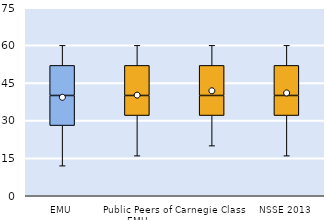
| Category | 25th | 50th | 75th |
|---|---|---|---|
| EMU | 28 | 12 | 12 |
| Public Peers of EMU | 32 | 8 | 12 |
| Carnegie Class | 32 | 8 | 12 |
| NSSE 2013 | 32 | 8 | 12 |